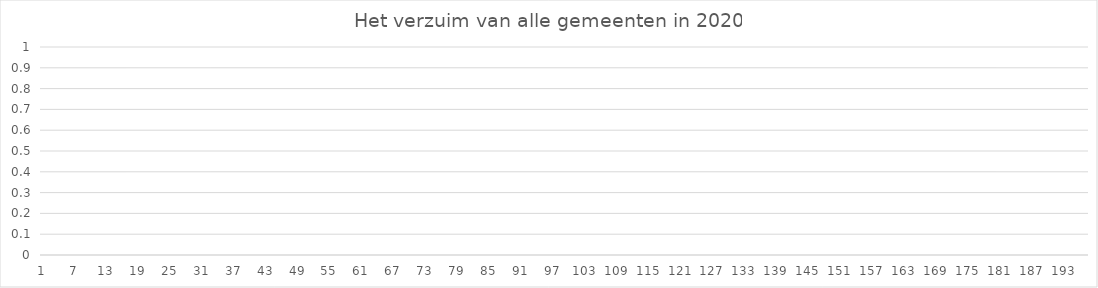
| Category | Series 0 |
|---|---|
| 0 | 2.24 |
| 1 | 2.52 |
| 2 | 2.95 |
| 3 | 3.1 |
| 4 | 3.16 |
| 5 | 3.2 |
| 6 | 3.2 |
| 7 | 3.28 |
| 8 | 3.3 |
| 9 | 3.31 |
| 10 | 3.56 |
| 11 | 3.57 |
| 12 | 3.57 |
| 13 | 3.6 |
| 14 | 3.68 |
| 15 | 3.7 |
| 16 | 3.78 |
| 17 | 3.8 |
| 18 | 3.8 |
| 19 | 3.84 |
| 20 | 3.85 |
| 21 | 3.88 |
| 22 | 3.91 |
| 23 | 3.92 |
| 24 | 3.94 |
| 25 | 3.95 |
| 26 | 3.96 |
| 27 | 3.97 |
| 28 | 3.98 |
| 29 | 4 |
| 30 | 4 |
| 31 | 4 |
| 32 | 4 |
| 33 | 4.02 |
| 34 | 4.16 |
| 35 | 4.18 |
| 36 | 4.18 |
| 37 | 4.19 |
| 38 | 4.2 |
| 39 | 4.2 |
| 40 | 4.24 |
| 41 | 4.25 |
| 42 | 4.26 |
| 43 | 4.3 |
| 44 | 4.32 |
| 45 | 4.33 |
| 46 | 4.36 |
| 47 | 4.37 |
| 48 | 4.38 |
| 49 | 4.4 |
| 50 | 4.4 |
| 51 | 4.42 |
| 52 | 4.42 |
| 53 | 4.44 |
| 54 | 4.45 |
| 55 | 4.47 |
| 56 | 4.51 |
| 57 | 4.52 |
| 58 | 4.54 |
| 59 | 4.56 |
| 60 | 4.58 |
| 61 | 4.6 |
| 62 | 4.6 |
| 63 | 4.62 |
| 64 | 4.65 |
| 65 | 4.68 |
| 66 | 4.73 |
| 67 | 4.74 |
| 68 | 4.75 |
| 69 | 4.79 |
| 70 | 4.8 |
| 71 | 4.8 |
| 72 | 4.87 |
| 73 | 4.9 |
| 74 | 4.91 |
| 75 | 4.93 |
| 76 | 4.97 |
| 77 | 4.98 |
| 78 | 4.99 |
| 79 | 5.02 |
| 80 | 5.03 |
| 81 | 5.05 |
| 82 | 5.05 |
| 83 | 5.07 |
| 84 | 5.09 |
| 85 | 5.1 |
| 86 | 5.11 |
| 87 | 5.11 |
| 88 | 5.17 |
| 89 | 5.18 |
| 90 | 5.2 |
| 91 | 5.21 |
| 92 | 5.24 |
| 93 | 5.25 |
| 94 | 5.27 |
| 95 | 5.29 |
| 96 | 5.29 |
| 97 | 5.3 |
| 98 | 5.32 |
| 99 | 5.33 |
| 100 | 5.34 |
| 101 | 5.35 |
| 102 | 5.37 |
| 103 | 5.37 |
| 104 | 5.4 |
| 105 | 5.4 |
| 106 | 5.4 |
| 107 | 5.4 |
| 108 | 5.4 |
| 109 | 5.4 |
| 110 | 5.4 |
| 111 | 5.41 |
| 112 | 5.42 |
| 113 | 5.43 |
| 114 | 5.44 |
| 115 | 5.46 |
| 116 | 5.5 |
| 117 | 5.5 |
| 118 | 5.55 |
| 119 | 5.58 |
| 120 | 5.59 |
| 121 | 5.62 |
| 122 | 5.63 |
| 123 | 5.65 |
| 124 | 5.66 |
| 125 | 5.66 |
| 126 | 5.7 |
| 127 | 5.7 |
| 128 | 5.77 |
| 129 | 5.77 |
| 130 | 5.79 |
| 131 | 5.8 |
| 132 | 5.86 |
| 133 | 5.89 |
| 134 | 5.92 |
| 135 | 5.94 |
| 136 | 5.98 |
| 137 | 5.98 |
| 138 | 6 |
| 139 | 6 |
| 140 | 6 |
| 141 | 6.03 |
| 142 | 6.09 |
| 143 | 6.1 |
| 144 | 6.12 |
| 145 | 6.12 |
| 146 | 6.18 |
| 147 | 6.2 |
| 148 | 6.21 |
| 149 | 6.21 |
| 150 | 6.23 |
| 151 | 6.25 |
| 152 | 6.27 |
| 153 | 6.29 |
| 154 | 6.33 |
| 155 | 6.37 |
| 156 | 6.4 |
| 157 | 6.48 |
| 158 | 6.5 |
| 159 | 6.5 |
| 160 | 6.55 |
| 161 | 6.59 |
| 162 | 6.6 |
| 163 | 6.6 |
| 164 | 6.6 |
| 165 | 6.61 |
| 166 | 6.7 |
| 167 | 6.74 |
| 168 | 6.76 |
| 169 | 6.76 |
| 170 | 6.79 |
| 171 | 6.79 |
| 172 | 6.82 |
| 173 | 6.93 |
| 174 | 7.07 |
| 175 | 7.09 |
| 176 | 7.15 |
| 177 | 7.2 |
| 178 | 7.26 |
| 179 | 7.46 |
| 180 | 7.5 |
| 181 | 7.51 |
| 182 | 7.56 |
| 183 | 7.71 |
| 184 | 7.72 |
| 185 | 7.77 |
| 186 | 7.91 |
| 187 | 7.92 |
| 188 | 7.95 |
| 189 | 8 |
| 190 | 8.21 |
| 191 | 8.25 |
| 192 | 8.34 |
| 193 | 8.34 |
| 194 | 8.56 |
| 195 | 9.05 |
| 196 | 12.76 |